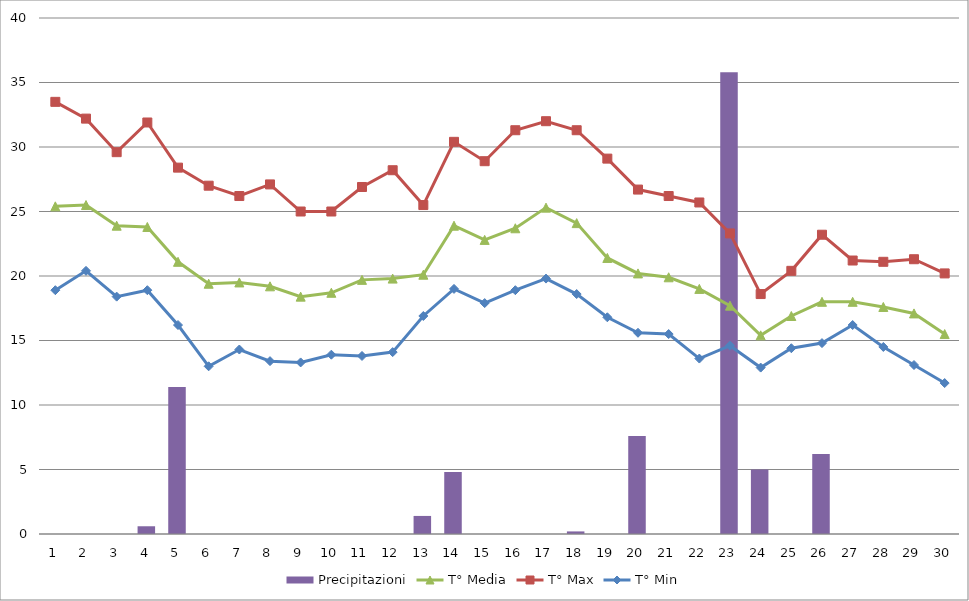
| Category | Precipitazioni |
|---|---|
| 0 | 0 |
| 1 | 0 |
| 2 | 0 |
| 3 | 0.6 |
| 4 | 11.4 |
| 5 | 0 |
| 6 | 0 |
| 7 | 0 |
| 8 | 0 |
| 9 | 0 |
| 10 | 0 |
| 11 | 0 |
| 12 | 1.4 |
| 13 | 4.8 |
| 14 | 0 |
| 15 | 0 |
| 16 | 0 |
| 17 | 0.2 |
| 18 | 0 |
| 19 | 7.6 |
| 20 | 0 |
| 21 | 0 |
| 22 | 35.8 |
| 23 | 5 |
| 24 | 0 |
| 25 | 6.2 |
| 26 | 0 |
| 27 | 0 |
| 28 | 0 |
| 29 | 0 |